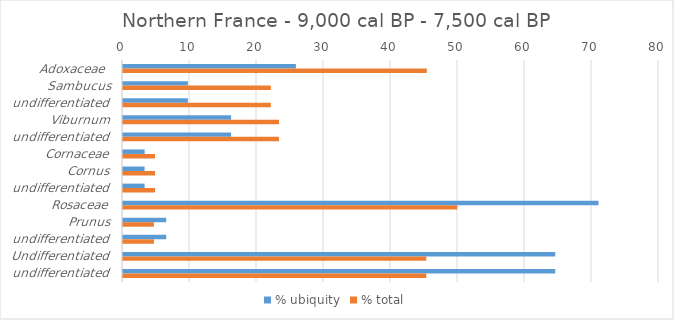
| Category | % ubiquity | % total |
|---|---|---|
| Adoxaceae  | 25.806 | 45.339 |
| Sambucus | 9.677 | 22.058 |
| undifferentiated | 9.677 | 22.058 |
| Viburnum | 16.129 | 23.282 |
| undifferentiated | 16.129 | 23.282 |
| Cornaceae | 3.226 | 4.78 |
| Cornus | 3.226 | 4.78 |
| undifferentiated | 3.226 | 4.78 |
| Rosaceae | 70.968 | 49.881 |
| Prunus | 6.452 | 4.615 |
| undifferentiated | 6.452 | 4.615 |
| Undifferentiated | 64.516 | 45.266 |
| undifferentiated | 64.516 | 45.266 |